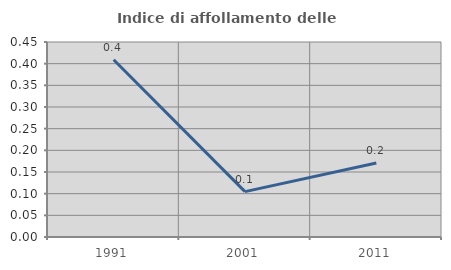
| Category | Indice di affollamento delle abitazioni  |
|---|---|
| 1991.0 | 0.409 |
| 2001.0 | 0.105 |
| 2011.0 | 0.171 |